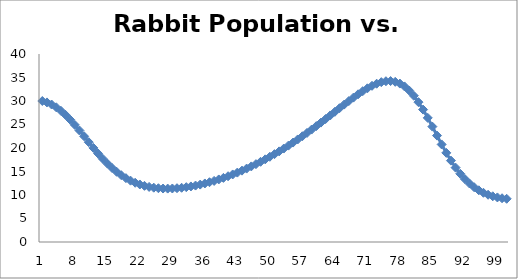
| Category | Series 0 |
|---|---|
| 0 | 30 |
| 1 | 29.7 |
| 2 | 29.255 |
| 3 | 28.66 |
| 4 | 27.917 |
| 5 | 27.034 |
| 6 | 26.026 |
| 7 | 24.913 |
| 8 | 23.725 |
| 9 | 22.49 |
| 10 | 21.243 |
| 11 | 20.014 |
| 12 | 18.832 |
| 13 | 17.72 |
| 14 | 16.694 |
| 15 | 15.765 |
| 16 | 14.937 |
| 17 | 14.211 |
| 18 | 13.584 |
| 19 | 13.051 |
| 20 | 12.605 |
| 21 | 12.24 |
| 22 | 11.947 |
| 23 | 11.721 |
| 24 | 11.554 |
| 25 | 11.442 |
| 26 | 11.379 |
| 27 | 11.361 |
| 28 | 11.383 |
| 29 | 11.443 |
| 30 | 11.538 |
| 31 | 11.664 |
| 32 | 11.821 |
| 33 | 12.006 |
| 34 | 12.217 |
| 35 | 12.455 |
| 36 | 12.716 |
| 37 | 13.002 |
| 38 | 13.31 |
| 39 | 13.641 |
| 40 | 13.995 |
| 41 | 14.369 |
| 42 | 14.766 |
| 43 | 15.183 |
| 44 | 15.622 |
| 45 | 16.081 |
| 46 | 16.562 |
| 47 | 17.063 |
| 48 | 17.586 |
| 49 | 18.129 |
| 50 | 18.693 |
| 51 | 19.278 |
| 52 | 19.883 |
| 53 | 20.508 |
| 54 | 21.154 |
| 55 | 21.818 |
| 56 | 22.502 |
| 57 | 23.203 |
| 58 | 23.921 |
| 59 | 24.654 |
| 60 | 25.401 |
| 61 | 26.159 |
| 62 | 26.925 |
| 63 | 27.696 |
| 64 | 28.467 |
| 65 | 29.232 |
| 66 | 29.986 |
| 67 | 30.721 |
| 68 | 31.425 |
| 69 | 32.088 |
| 70 | 32.696 |
| 71 | 33.232 |
| 72 | 33.677 |
| 73 | 34.01 |
| 74 | 34.206 |
| 75 | 34.239 |
| 76 | 34.082 |
| 77 | 33.71 |
| 78 | 33.1 |
| 79 | 32.237 |
| 80 | 31.118 |
| 81 | 29.753 |
| 82 | 28.17 |
| 83 | 26.416 |
| 84 | 24.55 |
| 85 | 22.642 |
| 86 | 20.761 |
| 87 | 18.968 |
| 88 | 17.312 |
| 89 | 15.824 |
| 90 | 14.517 |
| 91 | 13.392 |
| 92 | 12.441 |
| 93 | 11.648 |
| 94 | 10.997 |
| 95 | 10.471 |
| 96 | 10.053 |
| 97 | 9.728 |
| 98 | 9.483 |
| 99 | 9.309 |
| 100 | 9.194 |